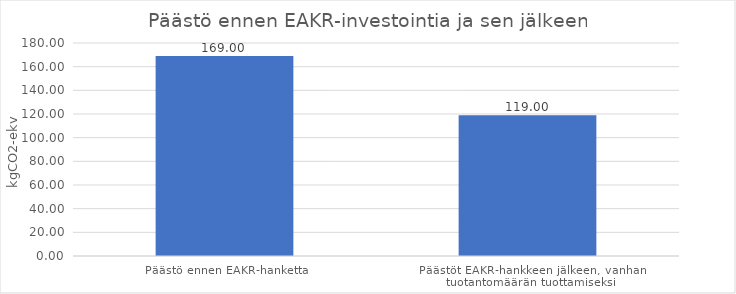
| Category | Series 0 |
|---|---|
| Päästö ennen EAKR-hanketta | 169 |
| Päästöt EAKR-hankkeen jälkeen, vanhan tuotantomäärän tuottamiseksi | 119 |